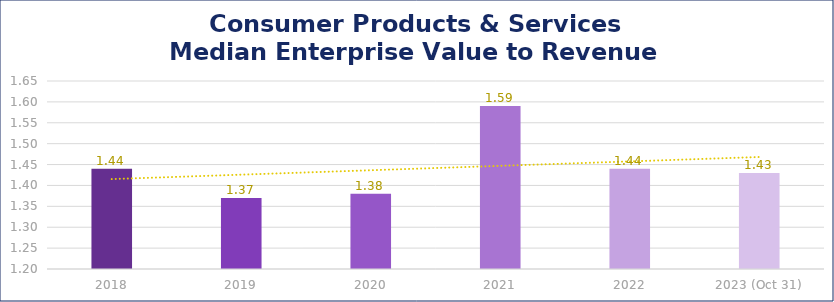
| Category | Consumer Products & Services |
|---|---|
| 2018 | 1.44 |
| 2019 | 1.37 |
| 2020 | 1.38 |
| 2021 | 1.59 |
| 2022 | 1.44 |
| 2023 (Oct 31) | 1.43 |